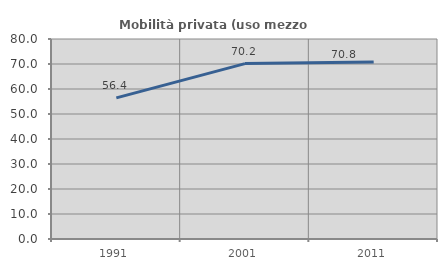
| Category | Mobilità privata (uso mezzo privato) |
|---|---|
| 1991.0 | 56.437 |
| 2001.0 | 70.167 |
| 2011.0 | 70.801 |